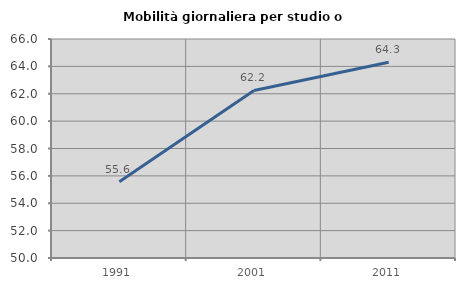
| Category | Mobilità giornaliera per studio o lavoro |
|---|---|
| 1991.0 | 55.572 |
| 2001.0 | 62.242 |
| 2011.0 | 64.295 |